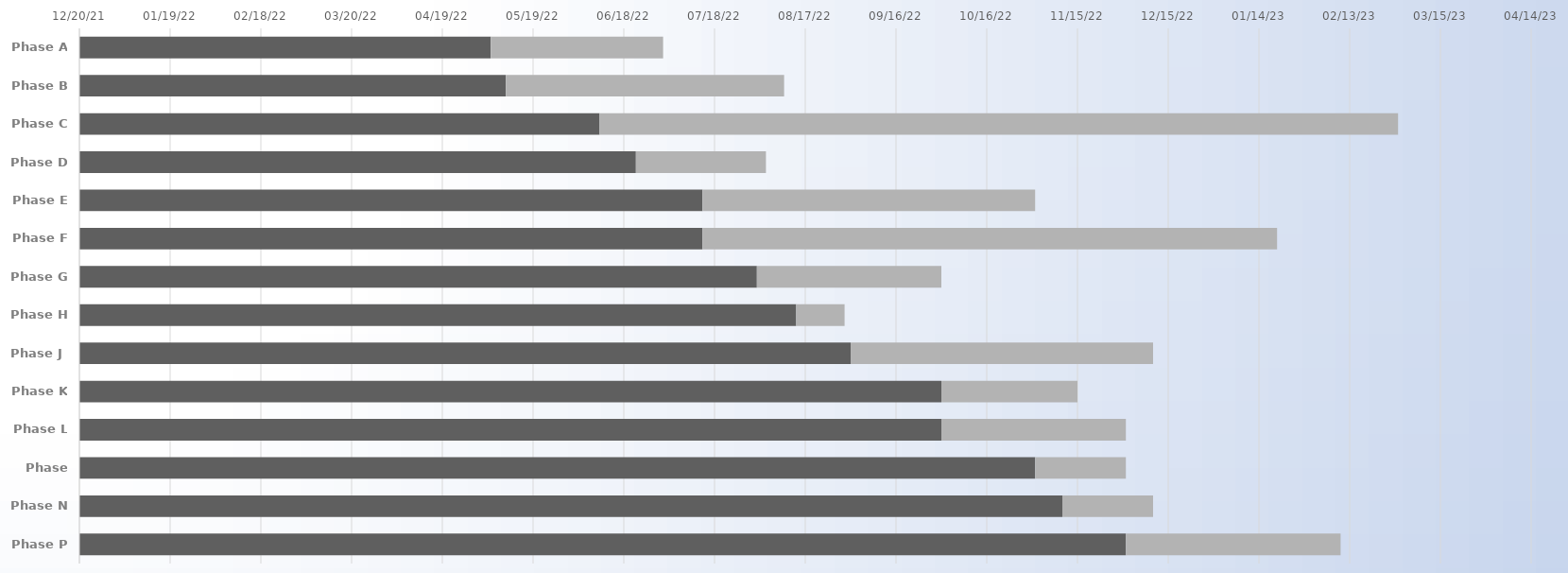
| Category | BEGIN | Duration |
|---|---|---|
| Phase A | 2022-05-05 | 57 |
| Phase B | 2022-05-10 | 92 |
| Phase C | 2022-06-10 | 264 |
| Phase D | 2022-06-22 | 43 |
| Phase E | 2022-07-14 | 110 |
| Phase F | 2022-07-14 | 190 |
| Phase G | 2022-08-01 | 61 |
| Phase H | 2022-08-14 | 16 |
| Phase J | 2022-09-01 | 100 |
| Phase K | 2022-10-01 | 45 |
| Phase L | 2022-10-01 | 61 |
| Phase M | 2022-11-01 | 30 |
| Phase N | 2022-11-10 | 30 |
| Phase P | 2022-12-01 | 71 |